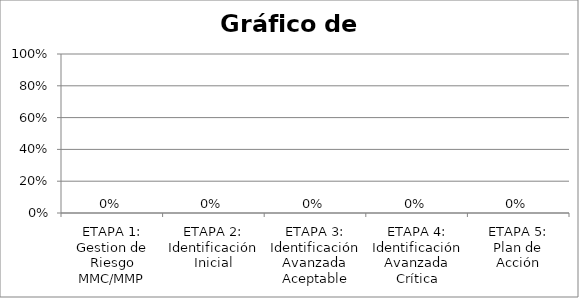
| Category | % SI |
|---|---|
| ETAPA 1: Gestion de Riesgo MMC/MMP | 0 |
| ETAPA 2: Identificación Inicial | 0 |
| ETAPA 3: Identificación Avanzada Aceptable | 0 |
| ETAPA 4:
Identificación Avanzada Crítica | 0 |
| ETAPA 5:
Plan de Acción | 0 |